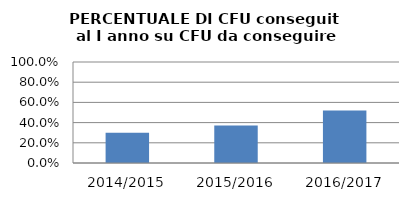
| Category | 2014/2015 2015/2016 2016/2017 |
|---|---|
| 2014/2015 | 0.3 |
| 2015/2016 | 0.373 |
| 2016/2017 | 0.521 |